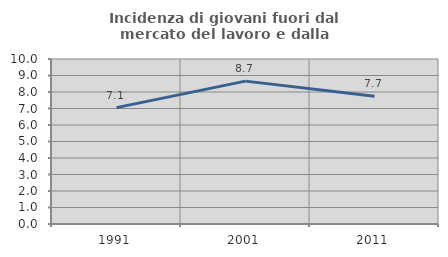
| Category | Incidenza di giovani fuori dal mercato del lavoro e dalla formazione  |
|---|---|
| 1991.0 | 7.054 |
| 2001.0 | 8.659 |
| 2011.0 | 7.746 |